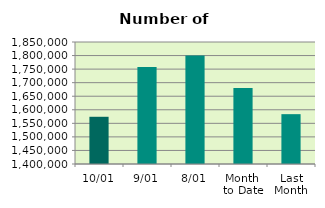
| Category | Series 0 |
|---|---|
| 10/01 | 1574160 |
| 9/01 | 1758168 |
| 8/01 | 1800132 |
| Month 
to Date | 1680729.429 |
| Last
Month | 1583843.3 |